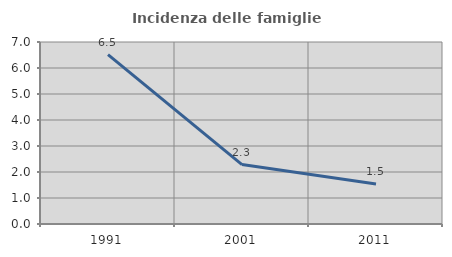
| Category | Incidenza delle famiglie numerose |
|---|---|
| 1991.0 | 6.516 |
| 2001.0 | 2.286 |
| 2011.0 | 1.535 |